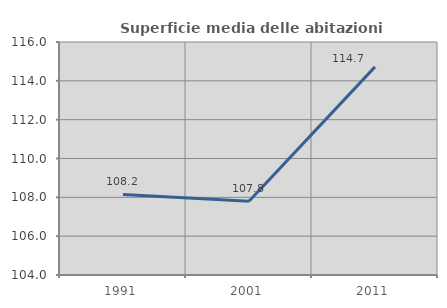
| Category | Superficie media delle abitazioni occupate |
|---|---|
| 1991.0 | 108.15 |
| 2001.0 | 107.794 |
| 2011.0 | 114.72 |